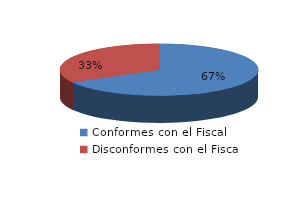
| Category | Series 0 |
|---|---|
| 0 | 739 |
| 1 | 368 |